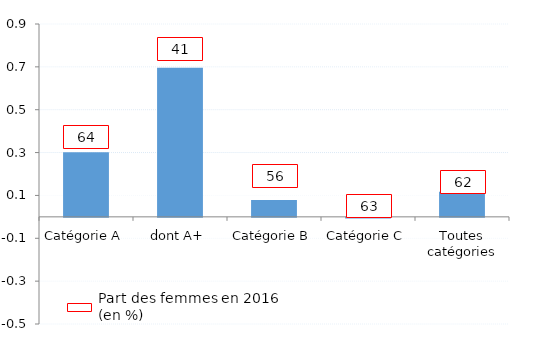
| Category | Series 0 |
|---|---|
| Catégorie A | 0.302 |
| dont A+ | 0.696 |
| Catégorie B | 0.079 |
| Catégorie C | -0.003 |
| Toutes catégories | 0.117 |